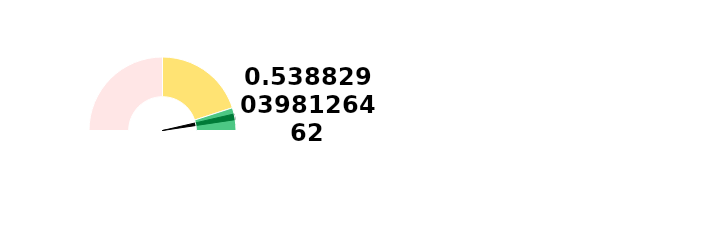
| Category | Ponteiro |
|---|---|
| 0 | 94.996 |
| 1 | 2.5 |
| 2 | 102.504 |